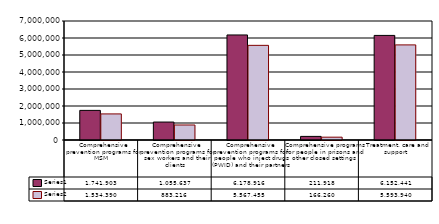
| Category | Series 0 | Series 1 |
|---|---|---|
| Comprehensive prevention programs for MSM | 1741903.028 | 1534389.982 |
| Comprehensive prevention programs for sex workers and their clients | 1055637.005 | 883215.675 |
| Comprehensive prevention programs for people who inject drugs (PWID) and their partners | 6178916.457 | 5567454.983 |
| Comprehensive programs for people in prisons and other closed settings | 211917.97 | 166259.674 |
| Treatment, care and support | 6152441.063 | 5593940.335 |